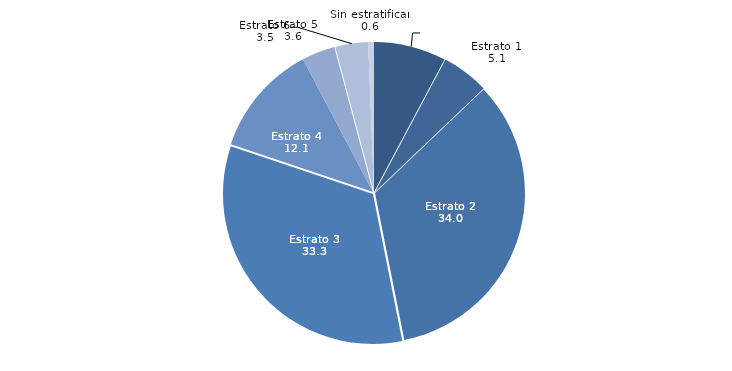
| Category | Series 0 |
|---|---|
| Corporativo | 7.784 |
| Estrato 1 | 5.096 |
| Estrato 2 | 33.969 |
| Estrato 3 | 33.278 |
| Estrato 4 | 12.11 |
| Estrato 5 | 3.574 |
| Estrato 6 | 3.524 |
| Sin estratificar | 0.625 |